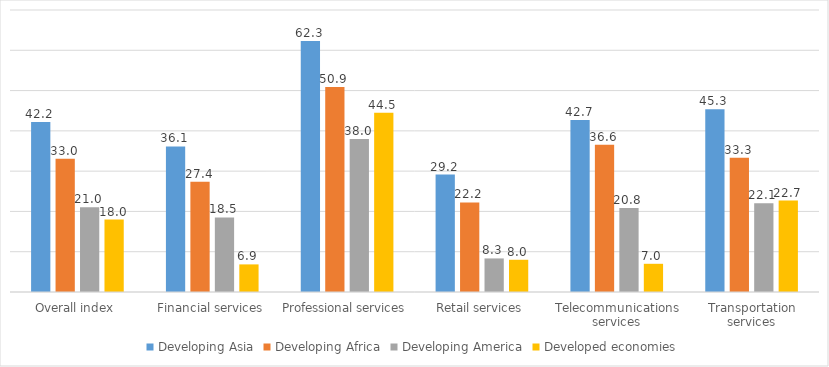
| Category | Developing Asia | Developing Africa | Developing America | Developed economies |
|---|---|---|---|---|
| Overall index | 42.204 | 33.048 | 21.017 | 17.984 |
| Financial services | 36.125 | 27.352 | 18.517 | 6.852 |
| Professional services | 62.333 | 50.889 | 37.972 | 44.48 |
| Retail services | 29.167 | 22.222 | 8.333 | 8 |
| Telecommunications services | 42.708 | 36.574 | 20.833 | 7 |
| Transportation services | 45.338 | 33.322 | 22.05 | 22.688 |